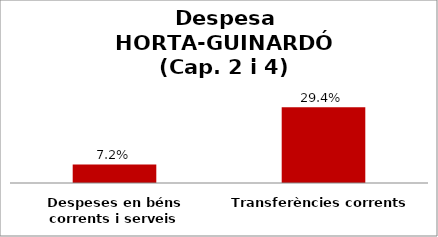
| Category | Series 0 |
|---|---|
| Despeses en béns corrents i serveis | 0.072 |
| Transferències corrents | 0.294 |